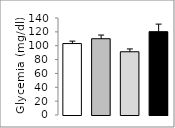
| Category | Series 0 |
|---|---|
| 0 | 103.111 |
| 1 | 110.083 |
| 2 | 91.273 |
| 3 | 120.25 |